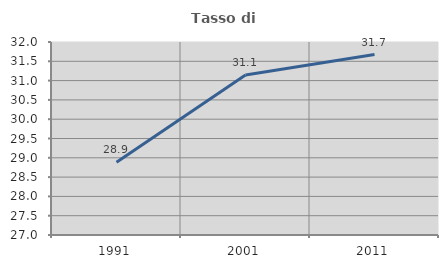
| Category | Tasso di occupazione   |
|---|---|
| 1991.0 | 28.883 |
| 2001.0 | 31.146 |
| 2011.0 | 31.675 |